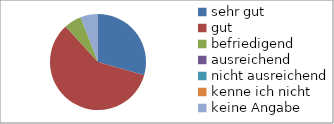
| Category | Series 0 |
|---|---|
| sehr gut | 5 |
| gut | 10 |
| befriedigend | 1 |
| ausreichend | 0 |
| nicht ausreichend | 0 |
| kenne ich nicht | 0 |
| keine Angabe | 1 |